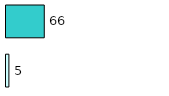
| Category | Series 0 | Series 1 |
|---|---|---|
| 0 | 5 | 66 |